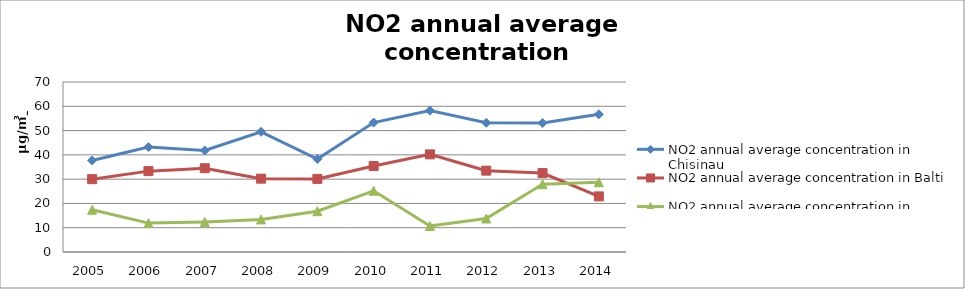
| Category | NO2 annual average concentration in Chisinau | NO2 annual average concentration in Balti | NO2 annual average concentration in Tiraspol |
|---|---|---|---|
| 2005.0 | 37.7 | 30 | 17.4 |
| 2006.0 | 43.2 | 33.3 | 11.9 |
| 2007.0 | 41.8 | 34.5 | 12.4 |
| 2008.0 | 49.5 | 30.2 | 13.4 |
| 2009.0 | 38.3 | 30.1 | 16.8 |
| 2010.0 | 53.3 | 35.4 | 25.2 |
| 2011.0 | 58.2 | 40.2 | 10.7 |
| 2012.0 | 53.2 | 33.5 | 13.8 |
| 2013.0 | 53.1 | 32.5 | 27.9 |
| 2014.0 | 56.7 | 22.9 | 28.7 |